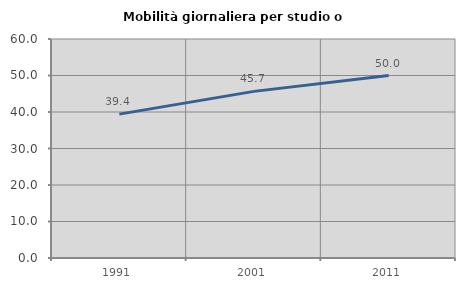
| Category | Mobilità giornaliera per studio o lavoro |
|---|---|
| 1991.0 | 39.423 |
| 2001.0 | 45.652 |
| 2011.0 | 50 |